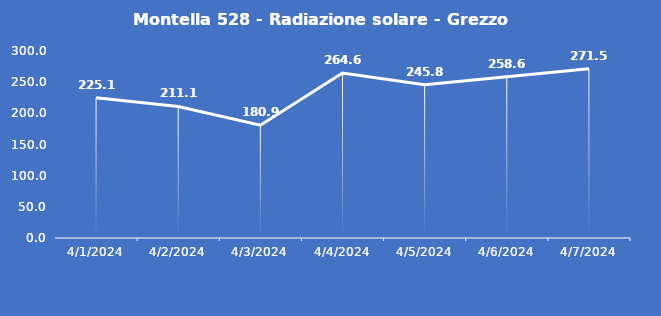
| Category | Montella 528 - Radiazione solare - Grezzo (W/m2) |
|---|---|
| 4/1/24 | 225.1 |
| 4/2/24 | 211.1 |
| 4/3/24 | 180.9 |
| 4/4/24 | 264.6 |
| 4/5/24 | 245.8 |
| 4/6/24 | 258.6 |
| 4/7/24 | 271.5 |